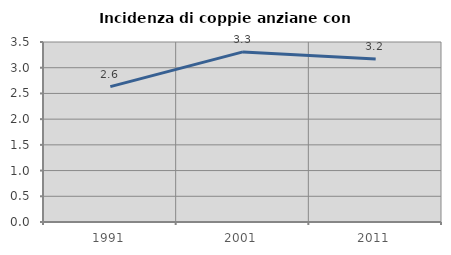
| Category | Incidenza di coppie anziane con figli |
|---|---|
| 1991.0 | 2.632 |
| 2001.0 | 3.308 |
| 2011.0 | 3.171 |